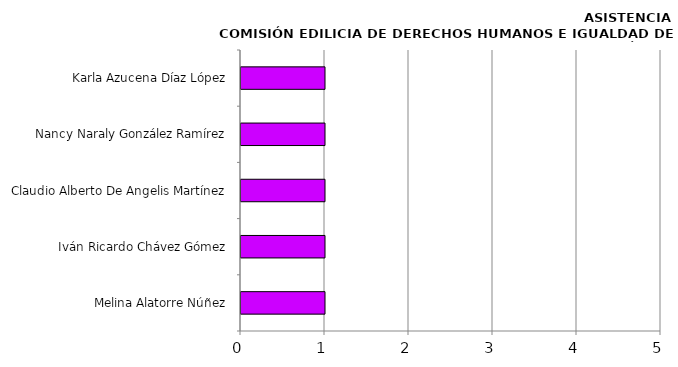
| Category | Series 0 |
|---|---|
| Melina Alatorre Núñez | 1 |
| Iván Ricardo Chávez Gómez | 1 |
| Claudio Alberto De Angelis Martínez | 1 |
| Nancy Naraly González Ramírez | 1 |
| Karla Azucena Díaz López | 1 |